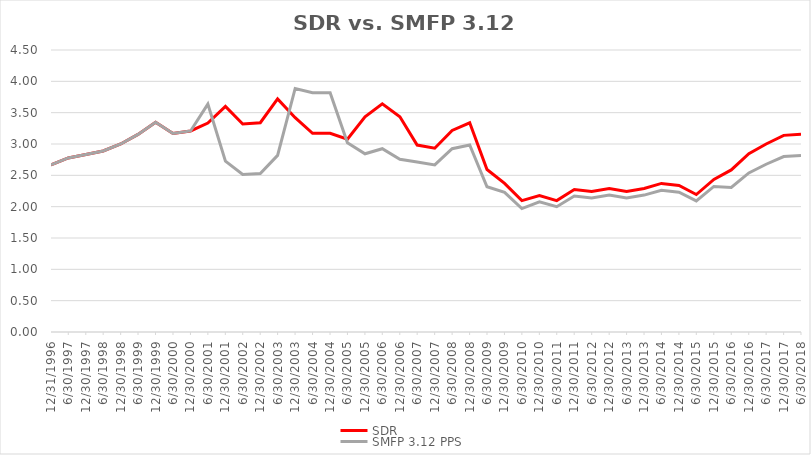
| Category | SDR | SMFP 3.12 PPS |
|---|---|---|
| 12/31/96 | 2.667 | 2.667 |
| 6/30/97 | 2.778 | 2.778 |
| 12/31/97 | 2.833 | 2.833 |
| 6/30/98 | 2.889 | 2.889 |
| 12/31/98 | 3 | 3 |
| 6/30/99 | 3.153 | 3.153 |
| 12/31/99 | 3.347 | 3.347 |
| 6/30/00 | 3.167 | 3.167 |
| 12/31/00 | 3.208 | 3.208 |
| 6/30/01 | 3.333 | 3.636 |
| 12/31/01 | 3.6 | 2.727 |
| 6/30/02 | 3.32 | 2.515 |
| 12/31/02 | 3.34 | 2.53 |
| 6/30/03 | 3.72 | 2.818 |
| 12/31/03 | 3.42 | 3.886 |
| 6/30/04 | 3.17 | 3.818 |
| 12/31/04 | 3.17 | 3.818 |
| 6/30/05 | 3.075 | 3.019 |
| 12/31/05 | 3.434 | 2.844 |
| 6/30/06 | 3.642 | 2.924 |
| 12/31/06 | 3.434 | 2.758 |
| 6/30/07 | 2.983 | 2.712 |
| 12/31/07 | 2.933 | 2.667 |
| 6/30/08 | 3.217 | 2.924 |
| 12/31/08 | 3.339 | 2.985 |
| 6/30/09 | 2.593 | 2.318 |
| 12/31/09 | 2.371 | 2.227 |
| 6/30/10 | 2.097 | 1.97 |
| 12/31/10 | 2.177 | 2.077 |
| 6/30/11 | 2.097 | 2 |
| 12/31/11 | 2.274 | 2.169 |
| 6/30/12 | 2.242 | 2.138 |
| 12/31/12 | 2.29 | 2.185 |
| 6/30/13 | 2.242 | 2.138 |
| 12/31/13 | 2.29 | 2.185 |
| 6/30/14 | 2.371 | 2.262 |
| 12/31/14 | 2.339 | 2.231 |
| 6/30/15 | 2.194 | 2.092 |
| 12/31/15 | 2.435 | 2.323 |
| 6/30/16 | 2.586 | 2.308 |
| 12/31/16 | 2.845 | 2.538 |
| 6/30/17 | 3 | 2.677 |
| 12/31/17 | 3.138 | 2.8 |
| 6/30/18 | 3.155 | 2.815 |